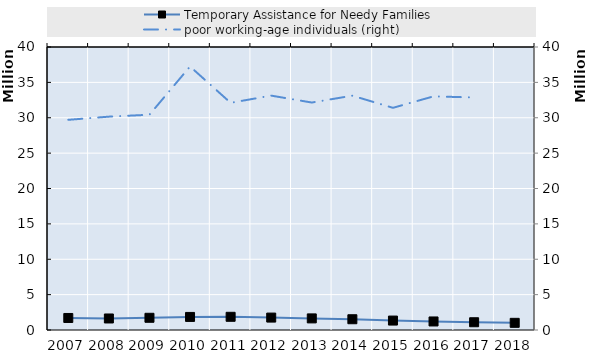
| Category | Temporary Assistance for Needy Families |
|---|---|
| 2007.0 | 1698892 |
| 2008.0 | 1628255 |
| 2009.0 | 1726799 |
| 2010.0 | 1847683 |
| 2011.0 | 1864187 |
| 2012.0 | 1753737 |
| 2013.0 | 1640654 |
| 2014.0 | 1520894 |
| 2015.0 | 1333858 |
| 2016.0 | 1207014 |
| 2017.0 | 1096663 |
| 2018.0 | 1013090 |